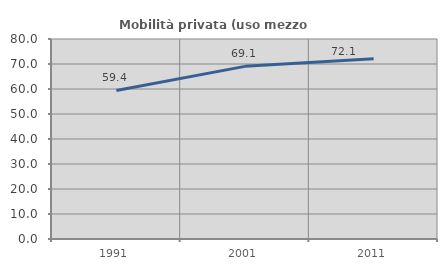
| Category | Mobilità privata (uso mezzo privato) |
|---|---|
| 1991.0 | 59.418 |
| 2001.0 | 69.059 |
| 2011.0 | 72.052 |